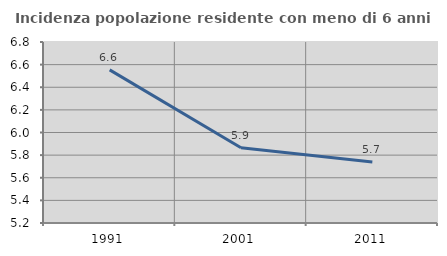
| Category | Incidenza popolazione residente con meno di 6 anni |
|---|---|
| 1991.0 | 6.553 |
| 2001.0 | 5.865 |
| 2011.0 | 5.74 |